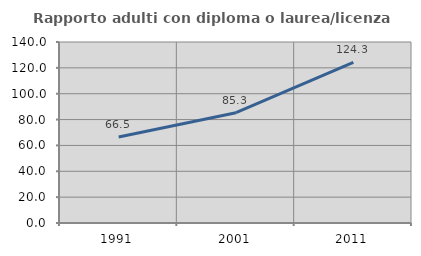
| Category | Rapporto adulti con diploma o laurea/licenza media  |
|---|---|
| 1991.0 | 66.537 |
| 2001.0 | 85.312 |
| 2011.0 | 124.29 |